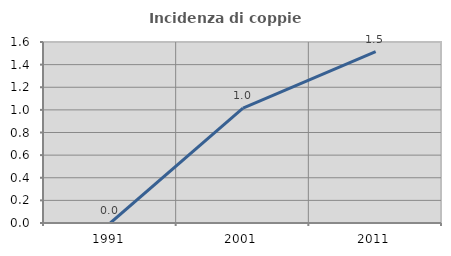
| Category | Incidenza di coppie miste |
|---|---|
| 1991.0 | 0 |
| 2001.0 | 1.015 |
| 2011.0 | 1.515 |